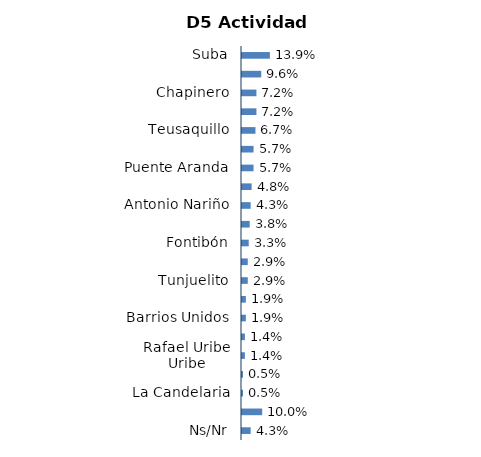
| Category | Series 0 |
|---|---|
| Suba | 0.139 |
| Usaquén | 0.096 |
| Chapinero | 0.072 |
| Kennedy | 0.072 |
| Teusaquillo | 0.067 |
| Engativá | 0.057 |
| Puente Aranda | 0.057 |
| Ciudad Bolívar | 0.048 |
| Antonio Nariño | 0.043 |
| Bosa | 0.038 |
| Fontibón | 0.033 |
| Usme | 0.029 |
| Tunjuelito | 0.029 |
| Santa Fe | 0.019 |
| Barrios Unidos | 0.019 |
| San Cristóbal | 0.014 |
| Rafael Uribe Uribe | 0.014 |
| Los Mártires | 0.005 |
| La Candelaria | 0.005 |
| Fuera de ciudad | 0.1 |
| Ns/Nr | 0.043 |